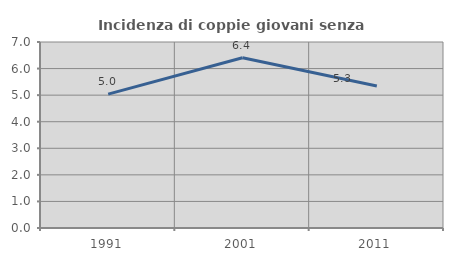
| Category | Incidenza di coppie giovani senza figli |
|---|---|
| 1991.0 | 5.037 |
| 2001.0 | 6.409 |
| 2011.0 | 5.345 |